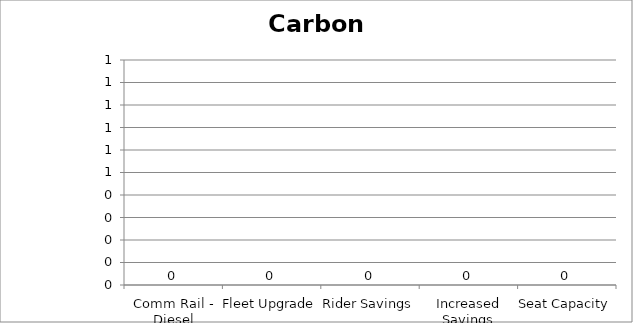
| Category | Carbon Monoxide |
|---|---|
| Comm Rail - Diesel | 0 |
| Fleet Upgrade | 0 |
| Rider Savings | 0 |
| Increased Savings | 0 |
| Seat Capacity | 0 |